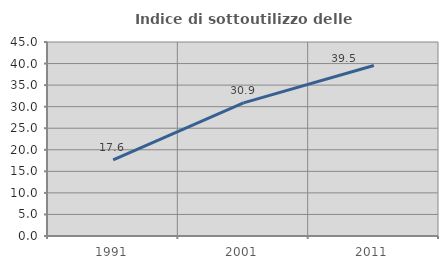
| Category | Indice di sottoutilizzo delle abitazioni  |
|---|---|
| 1991.0 | 17.643 |
| 2001.0 | 30.875 |
| 2011.0 | 39.547 |